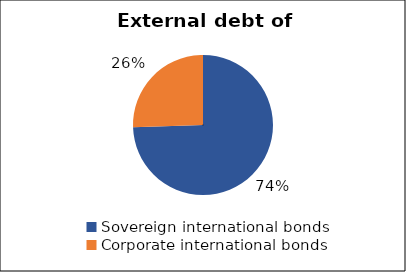
| Category | International bond market volume |
|---|---|
| Sovereign international bonds | 1.75 |
| Corporate international bonds | 0.6 |